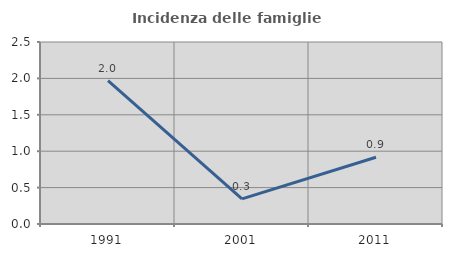
| Category | Incidenza delle famiglie numerose |
|---|---|
| 1991.0 | 1.969 |
| 2001.0 | 0.346 |
| 2011.0 | 0.917 |